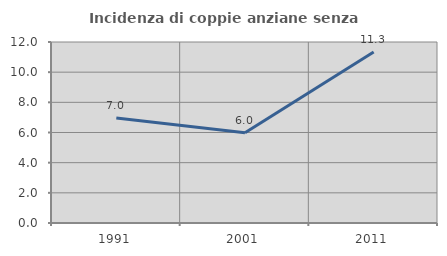
| Category | Incidenza di coppie anziane senza figli  |
|---|---|
| 1991.0 | 6.965 |
| 2001.0 | 5.978 |
| 2011.0 | 11.34 |